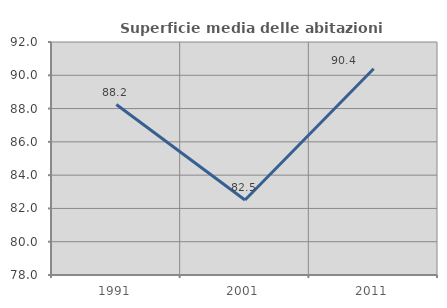
| Category | Superficie media delle abitazioni occupate |
|---|---|
| 1991.0 | 88.243 |
| 2001.0 | 82.506 |
| 2011.0 | 90.393 |